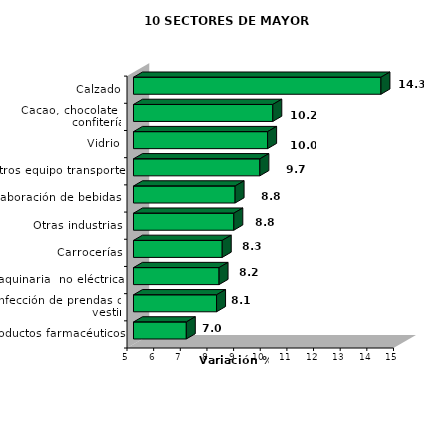
| Category | Series 0 |
|---|---|
| Calzado | 14.285 |
| Cacao, chocolate y confitería | 10.227 |
| Vidrio | 10.033 |
| Otros equipo transporte | 9.742 |
| Elaboración de bebidas  | 8.813 |
| Otras industrias | 8.764 |
| Carrocerías | 8.329 |
| Maquinaria  no eléctrica | 8.211 |
| Confección de prendas de vestir | 8.117 |
| Productos farmacéuticos | 6.982 |